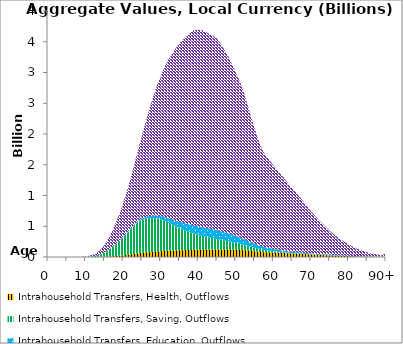
| Category | Intrahousehold Transfers, Health, Outflows | Intrahousehold Transfers, Saving, Outflows | Intrahousehold Transfers, Education, Outflows | Intrahousehold Transfers, Consumption other than health and education, Outflows |
|---|---|---|---|---|
| 0 | 0 | 0 | 0 | 0 |
|  | 0 | 0 | 0 | 0 |
| 2 | 0 | 0 | 0 | 0 |
| 3 | 0 | 0 | 0 | 0 |
| 4 | 0 | 0 | 0 | 0 |
| 5 | 0 | 0 | 0 | 0 |
| 6 | 0 | 0 | 0 | 0 |
| 7 | 0 | 0 | 0 | 0 |
| 8 | 0 | 0 | 0 | 0 |
| 9 | 0.068 | 1.442 | 0 | 4.526 |
| 10 | 0.342 | 3.716 | 0.05 | 9.278 |
| 11 | 0.613 | 5.977 | 0.12 | 14.003 |
| 12 | 1.219 | 11.312 | 0.257 | 25.288 |
| 13 | 2.071 | 20.431 | 0.464 | 42.953 |
| 14 | 3.858 | 39.551 | 0.996 | 77.008 |
| 15 | 6.096 | 65.148 | 1.716 | 119.664 |
| 16 | 9.29 | 101.218 | 2.845 | 183.927 |
| 17 | 12.457 | 141.662 | 4.139 | 254.025 |
| 18 | 16.45 | 189.058 | 5.958 | 340.874 |
| 19 | 20.5 | 235.095 | 7.695 | 432.288 |
| 20 | 26.483 | 294.39 | 9.706 | 549.063 |
| 21 | 33.304 | 351.081 | 11.72 | 669.451 |
| 22 | 41.99 | 410.454 | 13.901 | 816.099 |
| 23 | 50.142 | 462.47 | 16.059 | 981.298 |
| 24 | 58.765 | 508.249 | 18.687 | 1161.717 |
| 25 | 66.43 | 539.566 | 21.689 | 1349.486 |
| 26 | 72.935 | 550.348 | 25.765 | 1548.795 |
| 27 | 78.879 | 555.55 | 30.345 | 1745.463 |
| 28 | 84.392 | 549.576 | 37.114 | 1932.685 |
| 29 | 89.632 | 540.8 | 44.001 | 2113.155 |
| 30 | 94.15 | 516.918 | 52.606 | 2275.943 |
| 31 | 98.117 | 495.389 | 61.828 | 2430.654 |
| 32 | 101.238 | 459.657 | 71.881 | 2568.771 |
| 33 | 104.178 | 426.798 | 80.808 | 2690.7 |
| 34 | 106.741 | 392.508 | 90.641 | 2803.746 |
| 35 | 109.108 | 362.792 | 100.56 | 2903.538 |
| 36 | 110.851 | 333.895 | 109.109 | 2982.524 |
| 37 | 112.297 | 309.893 | 118.02 | 3055.385 |
| 38 | 113.807 | 286.898 | 126.954 | 3121.319 |
| 39 | 114.913 | 263.435 | 134.201 | 3179.92 |
| 40 | 117.019 | 242.217 | 139.053 | 3195.635 |
| 41 | 118.986 | 223.737 | 143.929 | 3200.761 |
| 42 | 121.077 | 208.418 | 145.525 | 3182.425 |
| 43 | 122.56 | 194.059 | 146.312 | 3165.601 |
| 44 | 123.223 | 181.645 | 146.279 | 3144.973 |
| 45 | 123.014 | 169.031 | 145.894 | 3112.414 |
| 46 | 122.734 | 156.882 | 140.854 | 3045.602 |
| 47 | 122.463 | 145.116 | 135.218 | 2963.096 |
| 48 | 121.27 | 134.578 | 128.919 | 2877.82 |
| 49 | 120.232 | 123.016 | 120.244 | 2770.573 |
| 50 | 118.051 | 111.97 | 110.829 | 2662.974 |
| 51 | 115.33 | 101.515 | 102.865 | 2552.408 |
| 52 | 110.77 | 90.679 | 93.948 | 2407.755 |
| 53 | 105.324 | 79.682 | 84.295 | 2240.278 |
| 54 | 98.528 | 68.582 | 74.051 | 2050.761 |
| 55 | 92.32 | 59.285 | 64.793 | 1880.699 |
| 56 | 85.591 | 50.567 | 56.191 | 1715.13 |
| 57 | 79.973 | 42.82 | 49.142 | 1580.304 |
| 58 | 76.389 | 35.437 | 43.74 | 1489 |
| 59 | 74.022 | 29.976 | 39.586 | 1427.677 |
| 60 | 71.283 | 23.768 | 35.672 | 1363.245 |
| 61 | 68.763 | 18.034 | 32.074 | 1301.39 |
| 62 | 66.158 | 13.77 | 29.049 | 1238.52 |
| 63 | 63.662 | 10.29 | 25.942 | 1170.48 |
| 64 | 60.928 | 7.921 | 23.417 | 1099.889 |
| 65 | 58.503 | 6.007 | 21.164 | 1034.158 |
| 66 | 56.034 | 4.977 | 19.159 | 971.489 |
| 67 | 53.035 | 4.15 | 17.29 | 905.501 |
| 68 | 49.463 | 3.641 | 15.516 | 834.181 |
| 69 | 45.566 | 3.068 | 13.707 | 760.573 |
| 70 | 41.813 | 2.757 | 12.758 | 690.782 |
| 71 | 38.303 | 2.536 | 12.474 | 623.98 |
| 72 | 35.01 | 2.258 | 12.367 | 560.621 |
| 73 | 31.776 | 1.948 | 11.952 | 501.373 |
| 74 | 28.664 | 1.615 | 11.075 | 445.961 |
| 75 | 25.593 | 1.206 | 10.078 | 393.384 |
| 76 | 22.911 | 0.949 | 8.944 | 343.858 |
| 77 | 20.442 | 0.717 | 7.86 | 298.502 |
| 78 | 17.933 | 0.522 | 6.821 | 257.674 |
| 79 | 15.843 | 0.385 | 6.204 | 220.941 |
| 80 | 13.663 | 0.285 | 5.455 | 187.328 |
| 81 | 11.345 | 0.228 | 4.877 | 156.787 |
| 82 | 9.212 | 0.197 | 4.284 | 130.022 |
| 83 | 7.391 | 0.158 | 3.686 | 107.132 |
| 84 | 5.862 | 0.132 | 3.053 | 87.577 |
| 85 | 4.66 | 0.102 | 2.463 | 70.466 |
| 86 | 4.711 | 0.067 | 1.796 | 55.672 |
| 87 | 4.4 | 0.047 | 1.289 | 43.316 |
| 88 | 2.236 | 0.045 | 0.995 | 33.257 |
| 89 | 1.202 | 0.042 | 0.766 | 25.152 |
| 90+ | 1.807 | 0.136 | 2.097 | 67.646 |